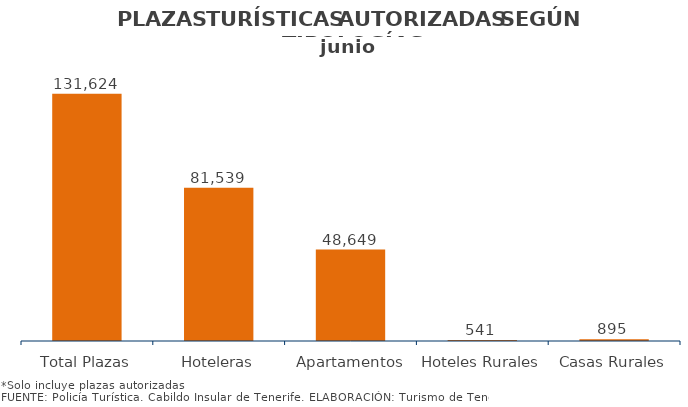
| Category | PLAZAS TURISTICAS AUTORIZADAS SEGÚN TIPOLOGÍA DEL ESTABLECIMIENTO.
Municipios e Isla junio 2014 |
|---|---|
| Total Plazas | 131624 |
| Hoteleras | 81539 |
| Apartamentos | 48649 |
| Hoteles Rurales | 541 |
| Casas Rurales | 895 |